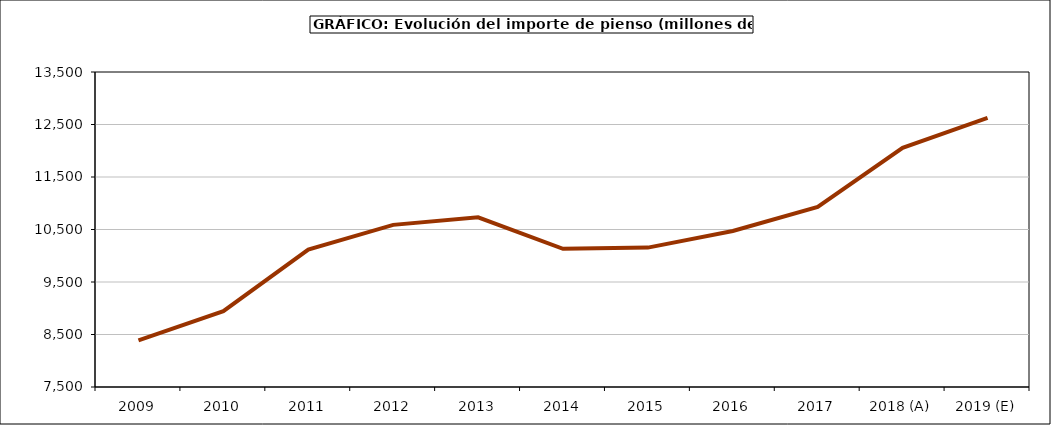
| Category | piensos |
|---|---|
| 2009 | 8388.144 |
| 2010 | 8943.629 |
| 2011 | 10115.595 |
| 2012 | 10588.115 |
| 2013 | 10733.318 |
| 2014 | 10132.591 |
| 2015 | 10154.98 |
| 2016 | 10470.8 |
| 2017 | 10928.619 |
| 2018 (A) | 12055.603 |
| 2019 (E) | 12624.187 |